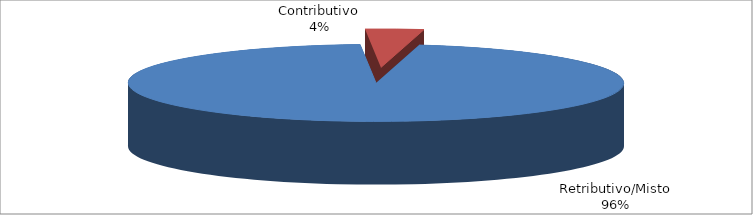
| Category | Decorrenti ANNO 2022 |
|---|---|
| Retributivo/Misto | 80711 |
| Contributivo | 3189 |